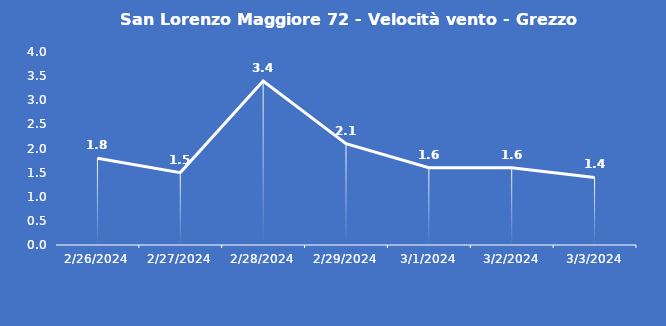
| Category | San Lorenzo Maggiore 72 - Velocità vento - Grezzo (m/s) |
|---|---|
| 2/26/24 | 1.8 |
| 2/27/24 | 1.5 |
| 2/28/24 | 3.4 |
| 2/29/24 | 2.1 |
| 3/1/24 | 1.6 |
| 3/2/24 | 1.6 |
| 3/3/24 | 1.4 |